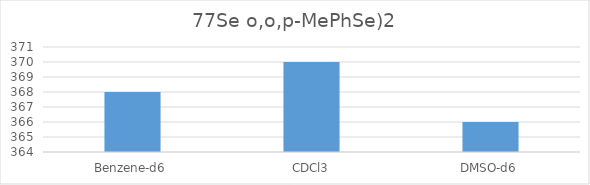
| Category | 77Se o,o,p-MePhSe)2 |
|---|---|
| Benzene-d6 | 368 |
| CDCl3 | 370 |
| DMSO-d6 | 366 |